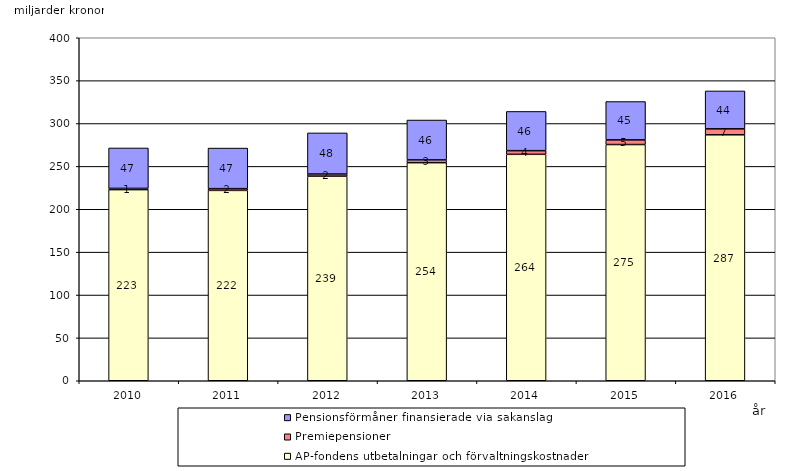
| Category | AP-fondens utbetalningar och förvaltningskostnader | Premiepensioner | Pensionsförmåner finansierade via sakanslag |
|---|---|---|---|
| 2010.0 | 222.897 | 1.412 | 47.171 |
| 2011.0 | 222.006 | 2.022 | 47.319 |
| 2012.0 | 238.644 | 2.448 | 47.922 |
| 2013.0 | 254.312 | 3.247 | 46.488 |
| 2014.0 | 264.065 | 4.264 | 45.747 |
| 2015.0 | 275.471 | 5.467 | 44.686 |
| 2016.0 | 286.862 | 6.929 | 44.187 |